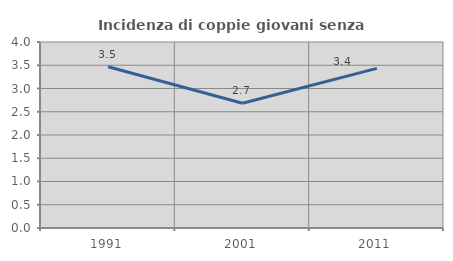
| Category | Incidenza di coppie giovani senza figli |
|---|---|
| 1991.0 | 3.467 |
| 2001.0 | 2.683 |
| 2011.0 | 3.433 |